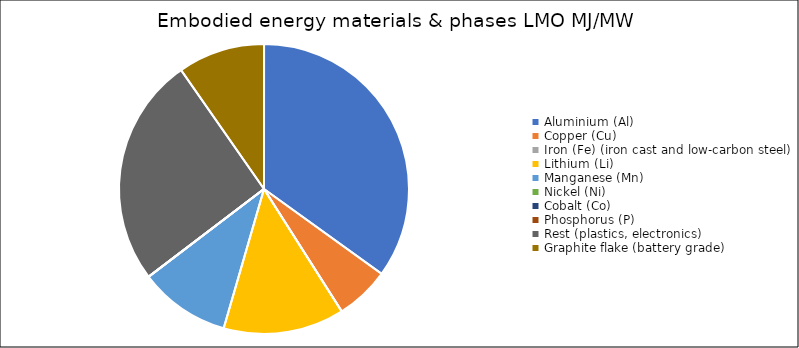
| Category | Embodied energy materials & phases LMO |
|---|---|
| Aluminium (Al) | 233264.378 |
| Copper (Cu) | 40355.964 |
| Iron (Fe) (iron cast and low-carbon steel) | 0 |
| Lithium (Li) | 90076.8 |
| Manganese (Mn) | 67873.766 |
| Nickel (Ni) | 0 |
| Cobalt (Co) | 0 |
| Phosphorus (P) | 0 |
| Rest (plastics, electronics) | 171211.425 |
| Graphite flake (battery grade) | 64761.84 |